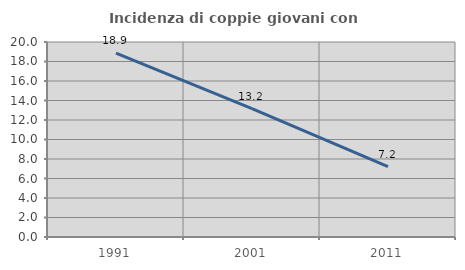
| Category | Incidenza di coppie giovani con figli |
|---|---|
| 1991.0 | 18.855 |
| 2001.0 | 13.162 |
| 2011.0 | 7.207 |